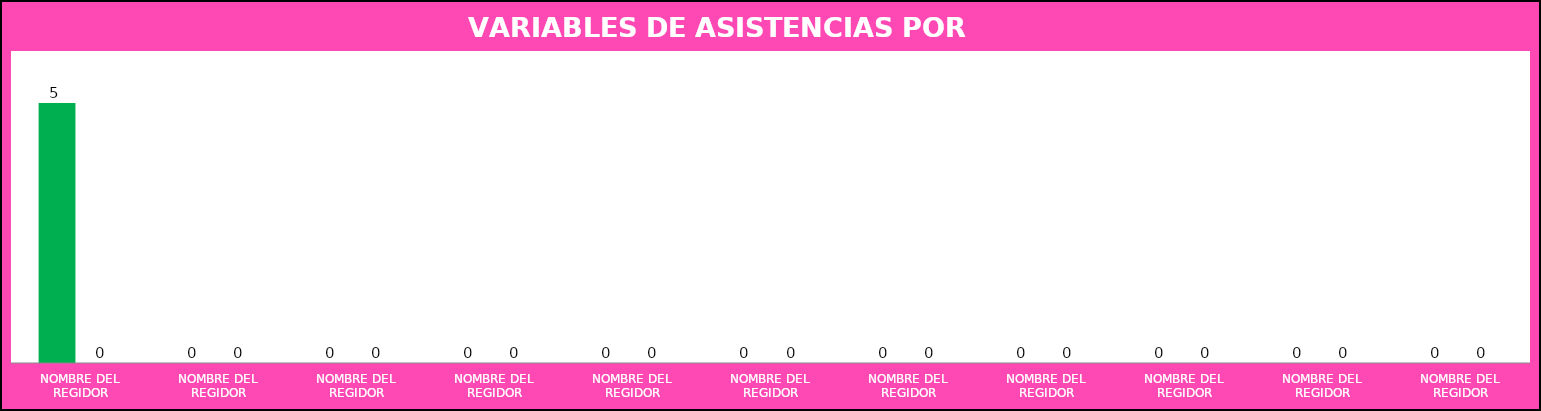
| Category | Series 0 | Series 1 |
|---|---|---|
| NOMBRE DEL REGIDOR | 5 | 0 |
| NOMBRE DEL REGIDOR | 0 | 0 |
| NOMBRE DEL REGIDOR | 0 | 0 |
| NOMBRE DEL REGIDOR | 0 | 0 |
| NOMBRE DEL REGIDOR | 0 | 0 |
| NOMBRE DEL REGIDOR | 0 | 0 |
| NOMBRE DEL REGIDOR | 0 | 0 |
| NOMBRE DEL REGIDOR | 0 | 0 |
| NOMBRE DEL REGIDOR | 0 | 0 |
| NOMBRE DEL REGIDOR | 0 | 0 |
| NOMBRE DEL REGIDOR | 0 | 0 |